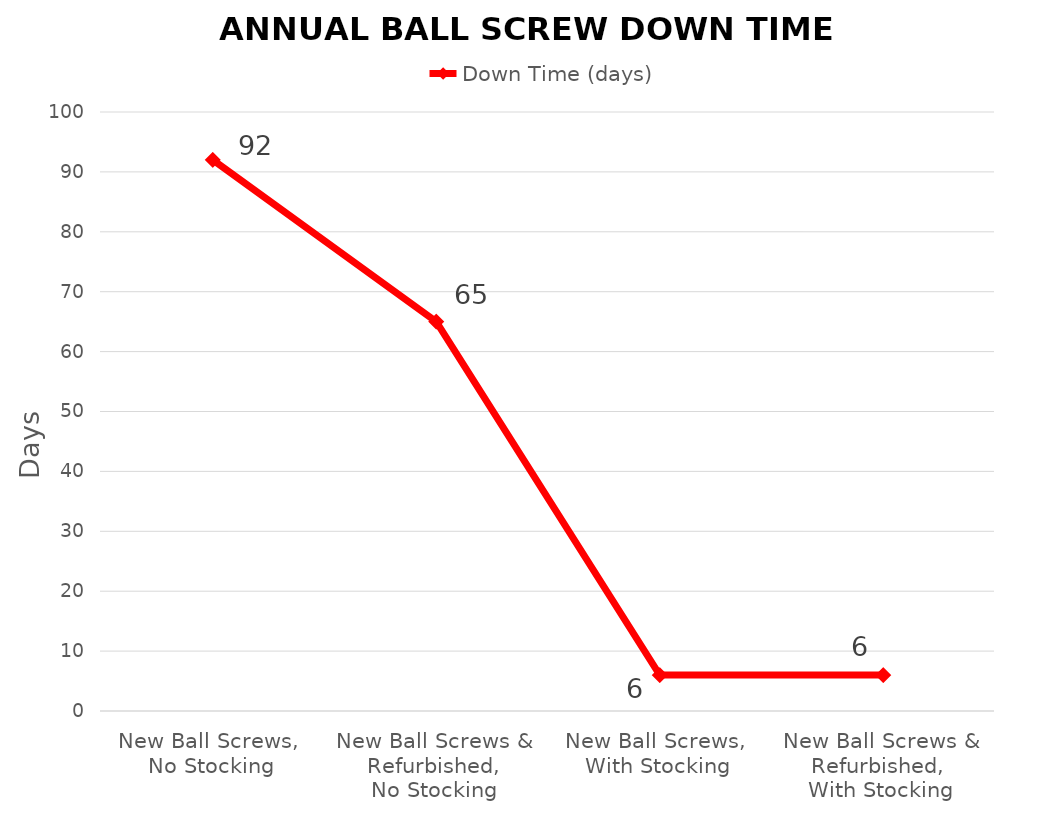
| Category | Down Time (days) |
|---|---|
| New Ball Screws, 
No Stocking | 92 |
| New Ball Screws & Refurbished,
No Stocking | 65 |
| New Ball Screws, 
With Stocking | 6 |
| New Ball Screws & Refurbished, 
With Stocking | 6 |